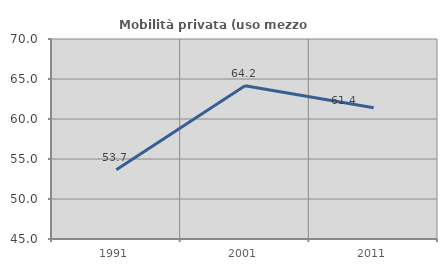
| Category | Mobilità privata (uso mezzo privato) |
|---|---|
| 1991.0 | 53.67 |
| 2001.0 | 64.167 |
| 2011.0 | 61.404 |